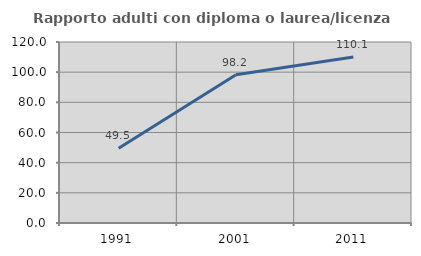
| Category | Rapporto adulti con diploma o laurea/licenza media  |
|---|---|
| 1991.0 | 49.505 |
| 2001.0 | 98.219 |
| 2011.0 | 110.127 |